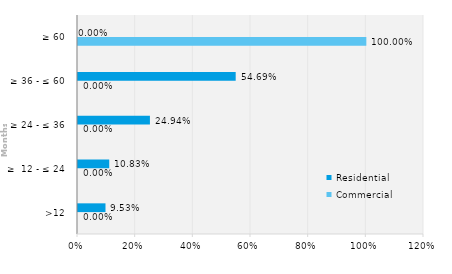
| Category | Commercial | Residential |
|---|---|---|
| >12 | 0 | 0.095 |
| ≥  12 - ≤ 24 | 0 | 0.108 |
| ≥ 24 - ≤ 36 | 0 | 0.249 |
| ≥ 36 - ≤ 60 | 0 | 0.547 |
| ≥ 60 | 1 | 0 |